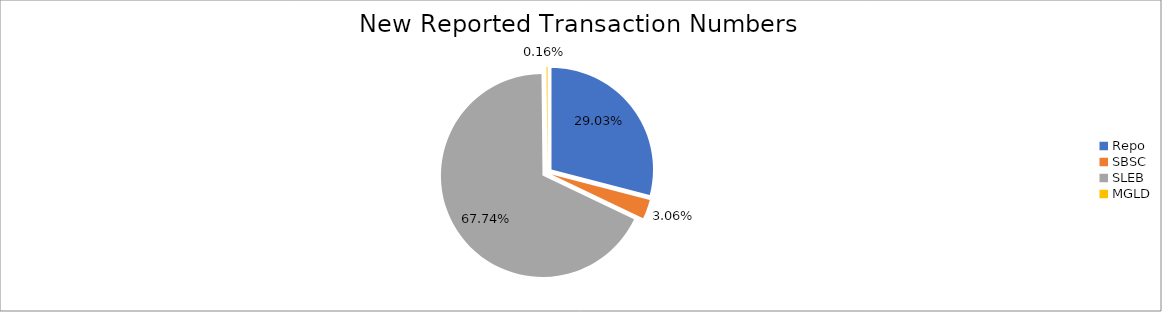
| Category | Series 0 |
|---|---|
| Repo | 341870 |
| SBSC | 36087 |
| SLEB | 797644 |
| MGLD | 1874 |